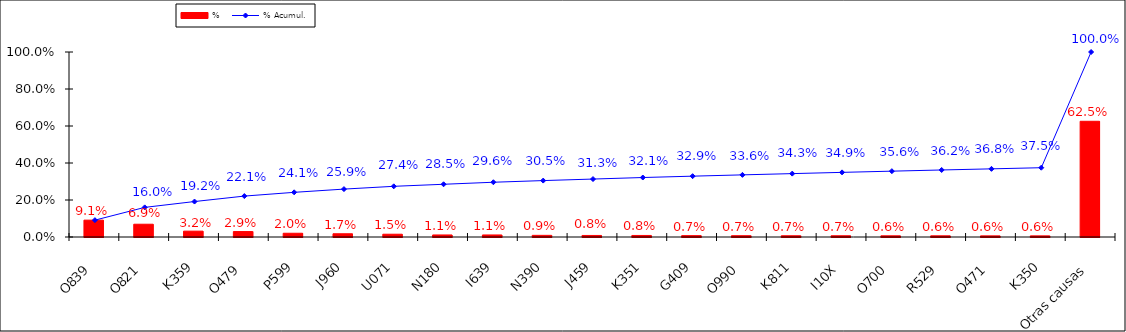
| Category | % |
|---|---|
| O839 | 0.091 |
| O821 | 0.069 |
| K359 | 0.032 |
| O479 | 0.029 |
| P599 | 0.02 |
| J960 | 0.017 |
| U071 | 0.015 |
| N180 | 0.011 |
| I639 | 0.011 |
| N390 | 0.009 |
| J459 | 0.008 |
| K351 | 0.008 |
| G409 | 0.007 |
| O990 | 0.007 |
| K811 | 0.007 |
| I10X | 0.007 |
| O700 | 0.006 |
| R529 | 0.006 |
| O471 | 0.006 |
| K350 | 0.006 |
| Otras causas | 0.625 |